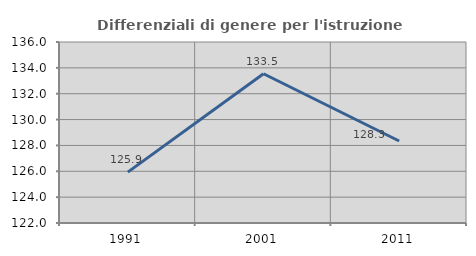
| Category | Differenziali di genere per l'istruzione superiore |
|---|---|
| 1991.0 | 125.935 |
| 2001.0 | 133.546 |
| 2011.0 | 128.342 |